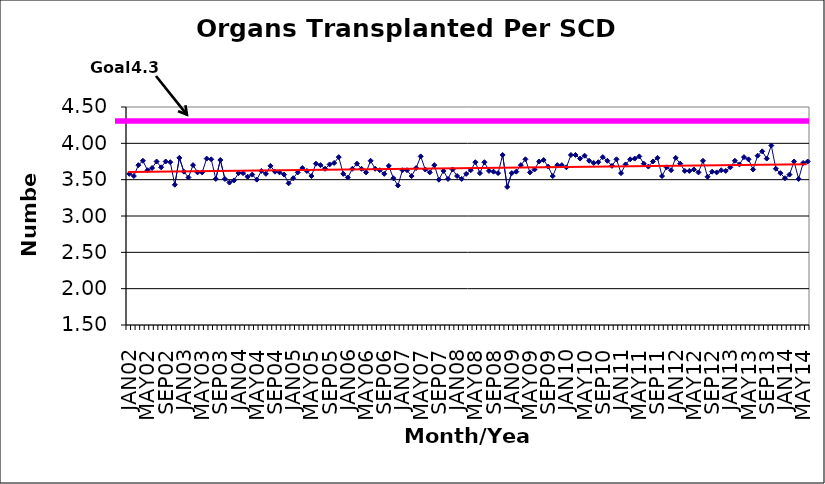
| Category | Series 0 |
|---|---|
| JAN02 | 3.58 |
| FEB02 | 3.55 |
| MAR02 | 3.7 |
| APR02 | 3.76 |
| MAY02 | 3.63 |
| JUN02 | 3.66 |
| JUL02 | 3.75 |
| AUG02 | 3.67 |
| SEP02 | 3.75 |
| OCT02 | 3.74 |
| NOV02 | 3.43 |
| DEC02 | 3.8 |
| JAN03 | 3.61 |
| FEB03 | 3.53 |
| MAR03 | 3.7 |
| APR03 | 3.6 |
| MAY03 | 3.6 |
| JUN03 | 3.79 |
| JUL03 | 3.78 |
| AUG03 | 3.51 |
| SEP03 | 3.77 |
| OCT03 | 3.51 |
| NOV03 | 3.46 |
| DEC03 | 3.49 |
| JAN04 | 3.59 |
| FEB04 | 3.59 |
| MAR04 | 3.54 |
| APR04 | 3.57 |
| MAY04 | 3.5 |
| JUN04 | 3.62 |
| JUL04 | 3.58 |
| AUG04 | 3.69 |
| SEP04 | 3.61 |
| OCT04 | 3.6 |
| NOV04 | 3.57 |
| DEC04 | 3.45 |
| JAN05 | 3.52 |
| FEB05 | 3.6 |
| MAR05 | 3.66 |
| APR05 | 3.62 |
| MAY05 | 3.55 |
| JUN05 | 3.72 |
| JUL05 | 3.7 |
| AUG05 | 3.65 |
| SEP05 | 3.71 |
| OCT05 | 3.73 |
| NOV05 | 3.81 |
| DEC05 | 3.58 |
| JAN06 | 3.53 |
| FEB06 | 3.65 |
| MAR06 | 3.72 |
| APR06 | 3.65 |
| MAY06 | 3.6 |
| JUN06 | 3.76 |
| JUL06 | 3.65 |
| AUG06 | 3.63 |
| SEP06 | 3.58 |
| OCT06 | 3.69 |
| NOV06 | 3.52 |
| DEC06 | 3.42 |
| JAN07 | 3.63 |
| FEB07 | 3.63 |
| MAR07 | 3.55 |
| APR07 | 3.66 |
| MAY07 | 3.82 |
| JUN07 | 3.64 |
| JUL07 | 3.6 |
| AUG07 | 3.7 |
| SEP07 | 3.5 |
| OCT07 | 3.62 |
| NOV07 | 3.51 |
| DEC07 | 3.64 |
| JAN08 | 3.55 |
| FEB08 | 3.51 |
| MAR08 | 3.58 |
| APR08 | 3.63 |
| MAY08 | 3.74 |
| JUN08 | 3.59 |
| JUL08 | 3.74 |
| AUG08 | 3.62 |
| SEP08 | 3.61 |
| OCT08 | 3.59 |
| NOV08 | 3.84 |
| DEC08 | 3.4 |
| JAN09 | 3.59 |
| FEB09 | 3.61 |
| MAR09 | 3.7 |
| APR09 | 3.78 |
| MAY09 | 3.6 |
| JUN09 | 3.64 |
| JUL09 | 3.75 |
| AUG09 | 3.77 |
| SEP09 | 3.68 |
| OCT09 | 3.55 |
| NOV09 | 3.7 |
| DEC09 | 3.7 |
| JAN10 | 3.67 |
| FEB10 | 3.84 |
| MAR10 | 3.84 |
| APR10 | 3.79 |
| MAY10 | 3.83 |
| JUN10 | 3.76 |
| JUL10 | 3.73 |
| AUG10 | 3.74 |
| SEP10 | 3.81 |
| OCT10 | 3.76 |
| NOV10 | 3.69 |
| DEC10 | 3.78 |
| JAN11 | 3.59 |
| FEB11 | 3.71 |
| MAR11 | 3.78 |
| APR11 | 3.79 |
| MAY11 | 3.82 |
| JUN11 | 3.72 |
| JUL11 | 3.68 |
| AUG11 | 3.75 |
| SEP11 | 3.8 |
| OCT11 | 3.55 |
| NOV11 | 3.67 |
| DEC11 | 3.63 |
| JAN12 | 3.8 |
| FEB12 | 3.72 |
| MAR12 | 3.62 |
| APR12 | 3.62 |
| MAY12 | 3.64 |
| JUN12 | 3.6 |
| JUL12 | 3.76 |
| AUG12 | 3.54 |
| SEP12 | 3.61 |
| OCT12 | 3.6 |
| NOV12 | 3.63 |
| DEC12 | 3.62 |
| JAN13 | 3.67 |
| FEB13 | 3.76 |
| MAR13 | 3.71 |
| APR13 | 3.81 |
| MAY13 | 3.78 |
| JUN13 | 3.64 |
| JUL13 | 3.83 |
| AUG13 | 3.89 |
| SEP13 | 3.79 |
| OCT13 | 3.97 |
| NOV13 | 3.65 |
| DEC13 | 3.59 |
| JAN14 | 3.52 |
| FEB14 | 3.57 |
| MAR14 | 3.75 |
| APR14 | 3.51 |
| MAY14 | 3.73 |
| JUN14 | 3.75 |